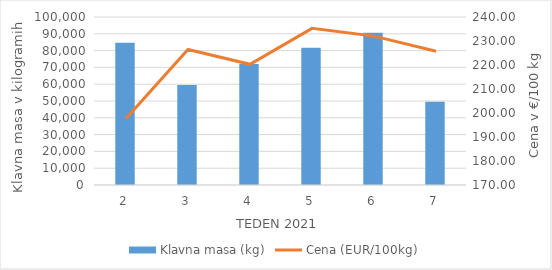
| Category | Klavna masa (kg) |
|---|---|
| 2.0 | 84639 |
| 3.0 | 59476 |
| 4.0 | 72013 |
| 5.0 | 81759 |
| 6.0 | 90669 |
| 7.0 | 49517 |